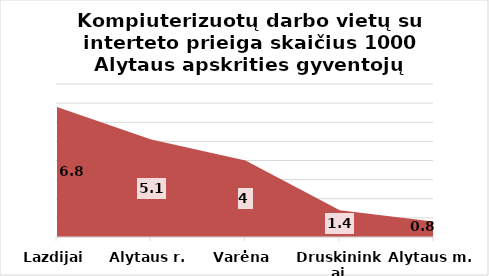
| Category | Series 0 |
|---|---|
| Lazdijai | 6.8 |
| Alytaus r. | 5.1 |
| Varėna | 4 |
| Druskininkai | 1.4 |
| Alytaus m. | 0.8 |